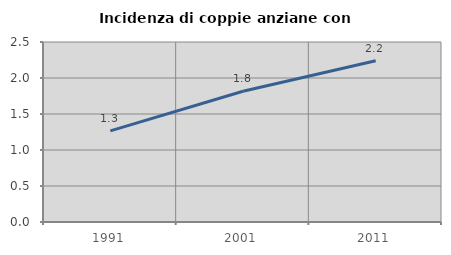
| Category | Incidenza di coppie anziane con figli |
|---|---|
| 1991.0 | 1.266 |
| 2001.0 | 1.815 |
| 2011.0 | 2.241 |